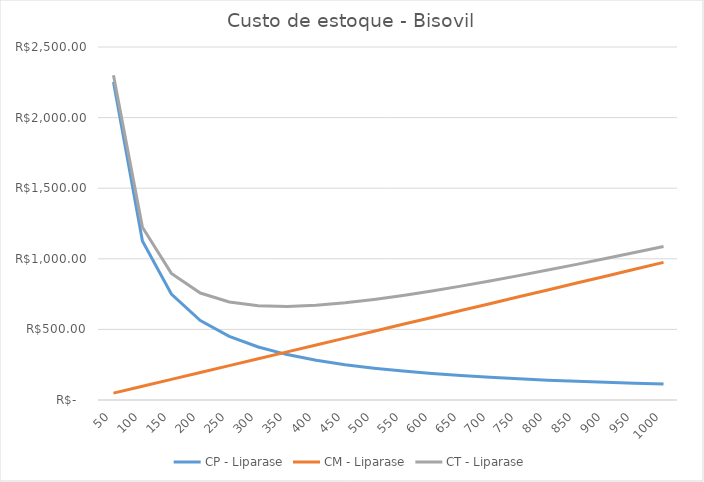
| Category | CP - Liparase | CM - Liparase | CT - Liparase |
|---|---|---|---|
| 50.0 | 2251.374 | 48.72 | 2300.094 |
| 100.0 | 1125.687 | 97.44 | 1223.127 |
| 150.0 | 750.458 | 146.16 | 896.618 |
| 200.0 | 562.843 | 194.88 | 757.723 |
| 250.0 | 450.275 | 243.6 | 693.875 |
| 300.0 | 375.229 | 292.32 | 667.549 |
| 350.0 | 321.625 | 341.04 | 662.665 |
| 400.0 | 281.422 | 389.76 | 671.182 |
| 450.0 | 250.153 | 438.48 | 688.633 |
| 500.0 | 225.137 | 487.2 | 712.337 |
| 550.0 | 204.67 | 535.92 | 740.59 |
| 600.0 | 187.614 | 584.64 | 772.254 |
| 650.0 | 173.183 | 633.36 | 806.543 |
| 700.0 | 160.812 | 682.08 | 842.892 |
| 750.0 | 150.092 | 730.8 | 880.892 |
| 800.0 | 140.711 | 779.52 | 920.231 |
| 850.0 | 132.434 | 828.24 | 960.674 |
| 900.0 | 125.076 | 876.96 | 1002.036 |
| 950.0 | 118.493 | 925.68 | 1044.173 |
| 1000.0 | 112.569 | 974.4 | 1086.969 |